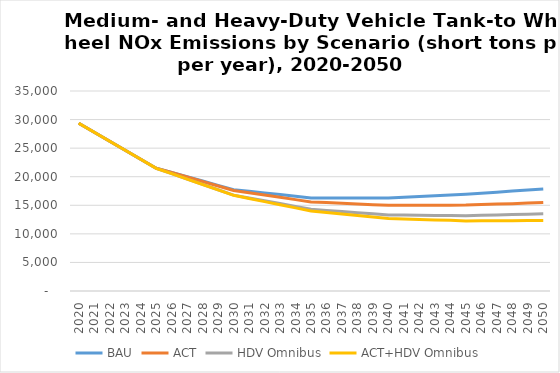
| Category | BAU | ACT | HDV Omnibus | ACT+HDV Omnibus |
|---|---|---|---|---|
| 2020.0 | 29360 | 29360 | 29360 | 29360 |
| 2021.0 | 27790 | 27790 | 27790 | 27790 |
| 2022.0 | 26210 | 26210 | 26210 | 26210 |
| 2023.0 | 24640 | 24640 | 24640 | 24640 |
| 2024.0 | 23060 | 23060 | 23060 | 23060 |
| 2025.0 | 21490 | 21490 | 21470 | 21470 |
| 2026.0 | 20740 | 20740 | 20530 | 20530 |
| 2027.0 | 19990 | 19950 | 19590 | 19580 |
| 2028.0 | 19240 | 19170 | 18660 | 18640 |
| 2029.0 | 18490 | 18380 | 17720 | 17690 |
| 2030.0 | 17740 | 17590 | 16780 | 16740 |
| 2031.0 | 17450 | 17190 | 16290 | 16190 |
| 2032.0 | 17160 | 16790 | 15790 | 15640 |
| 2033.0 | 16870 | 16390 | 15300 | 15100 |
| 2034.0 | 16580 | 15990 | 14800 | 14550 |
| 2035.0 | 16290 | 15590 | 14310 | 14000 |
| 2036.0 | 16290 | 15470 | 14110 | 13740 |
| 2037.0 | 16290 | 15350 | 13910 | 13480 |
| 2038.0 | 16290 | 15230 | 13700 | 13220 |
| 2039.0 | 16290 | 15110 | 13500 | 12960 |
| 2040.0 | 16290 | 14990 | 13300 | 12700 |
| 2041.0 | 16420 | 15000 | 13280 | 12610 |
| 2042.0 | 16540 | 15010 | 13250 | 12530 |
| 2043.0 | 16670 | 15010 | 13230 | 12440 |
| 2044.0 | 16790 | 15020 | 13200 | 12360 |
| 2045.0 | 16920 | 15030 | 13180 | 12270 |
| 2046.0 | 17110 | 15120 | 13250 | 12280 |
| 2047.0 | 17300 | 15210 | 13310 | 12290 |
| 2048.0 | 17480 | 15290 | 13380 | 12310 |
| 2049.0 | 17670 | 15380 | 13440 | 12320 |
| 2050.0 | 17860 | 15470 | 13510 | 12330 |